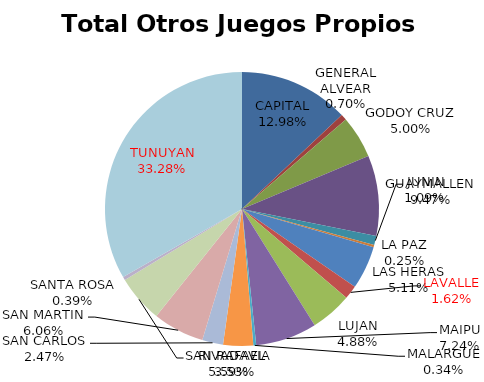
| Category | Total Otros Juegos Propios Beneficio |
|---|---|
| CAPITAL | 161961.34 |
| GENERAL ALVEAR | 8772.57 |
| GODOY CRUZ | 62373.19 |
| GUAYMALLEN | 118122.14 |
| JUNIN | 13554.18 |
| LA PAZ | 3060.46 |
| LAS HERAS | 63768.9 |
| LAVALLE | -20258 |
| LUJAN | 60845.87 |
| MAIPU | 90294.42 |
| MALARGUE | 4242.4 |
| RIVADAVIA | 44074.78 |
| SAN CARLOS | 30743.3 |
| SAN MARTIN | 75641.69 |
| SAN RAFAEL  | 69761.02 |
| SANTA ROSA | 4834.2 |
| TUNUYAN | -415075.35 |